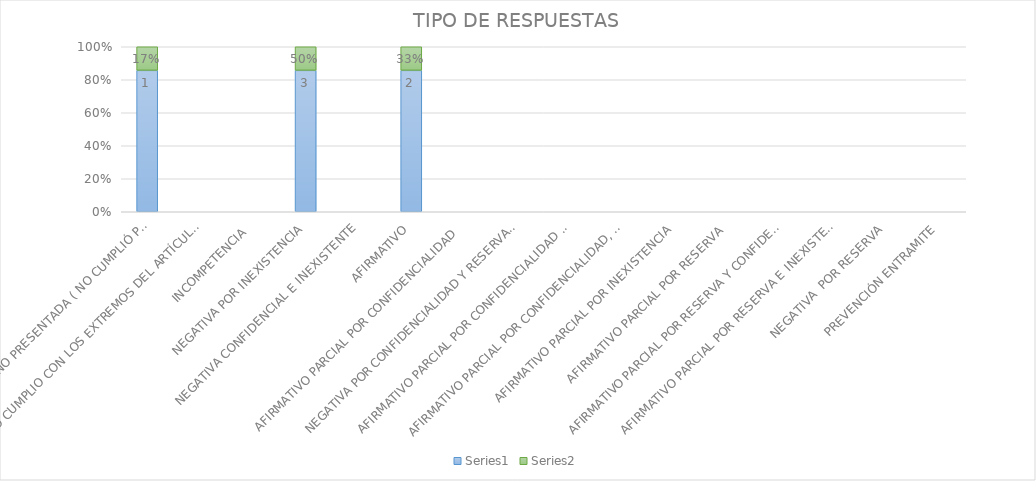
| Category | Series 4 | Series 5 |
|---|---|---|
| SE TIENE POR NO PRESENTADA ( NO CUMPLIÓ PREVENCIÓN) | 1 | 0.167 |
| NO CUMPLIO CON LOS EXTREMOS DEL ARTÍCULO 79 (REQUISITOS) | 0 | 0 |
| INCOMPETENCIA  | 0 | 0 |
| NEGATIVA POR INEXISTENCIA | 3 | 0.5 |
| NEGATIVA CONFIDENCIAL E INEXISTENTE | 0 | 0 |
| AFIRMATIVO | 2 | 0.333 |
| AFIRMATIVO PARCIAL POR CONFIDENCIALIDAD  | 0 | 0 |
| NEGATIVA POR CONFIDENCIALIDAD Y RESERVADA | 0 | 0 |
| AFIRMATIVO PARCIAL POR CONFIDENCIALIDAD E INEXISTENCIA | 0 | 0 |
| AFIRMATIVO PARCIAL POR CONFIDENCIALIDAD, RESERVA E INEXISTENCIA | 0 | 0 |
| AFIRMATIVO PARCIAL POR INEXISTENCIA | 0 | 0 |
| AFIRMATIVO PARCIAL POR RESERVA | 0 | 0 |
| AFIRMATIVO PARCIAL POR RESERVA Y CONFIDENCIALIDAD | 0 | 0 |
| AFIRMATIVO PARCIAL POR RESERVA E INEXISTENCIA | 0 | 0 |
| NEGATIVA  POR RESERVA | 0 | 0 |
| PREVENCIÓN ENTRAMITE | 0 | 0 |